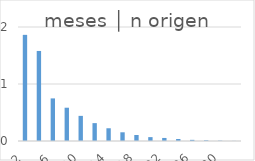
| Category | meses │ n origen |
|---|---|
| 2.0 | 1.862 |
| 4.0 | 1.58 |
| 6.0 | 0.747 |
| 8.0 | 0.584 |
| 10.0 | 0.441 |
| 12.0 | 0.314 |
| 14.0 | 0.223 |
| 16.0 | 0.153 |
| 18.0 | 0.105 |
| 20.0 | 0.068 |
| 22.0 | 0.054 |
| 24.0 | 0.035 |
| 26.0 | 0.02 |
| 28.0 | 0.012 |
| 30.0 | 0.006 |
| 32.0 | 0.002 |